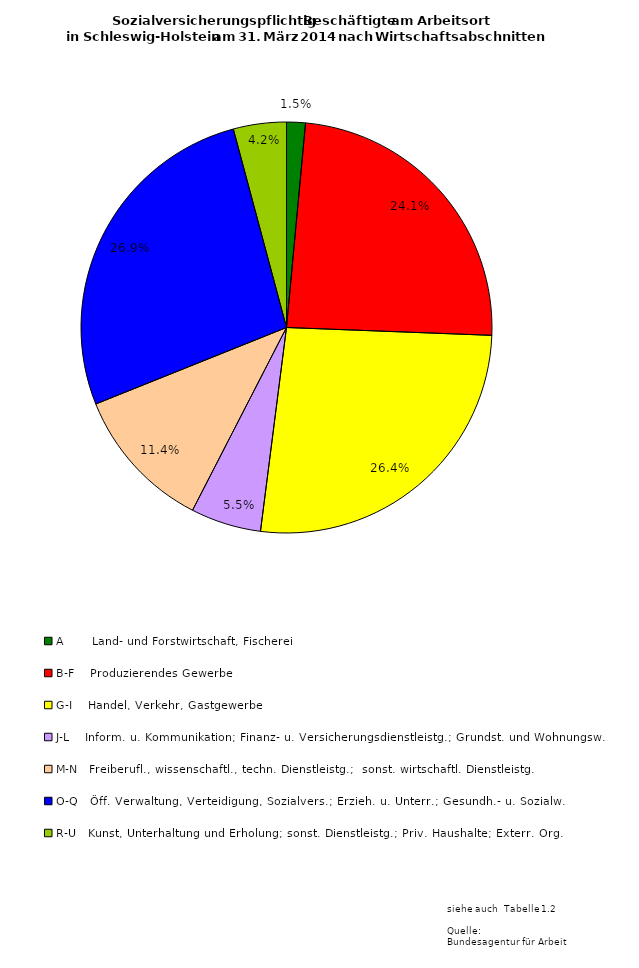
| Category | Series 0 | Series 1 | Series 2 |
|---|---|---|---|
| A       Land- und Forstwirtschaft, Fischerei | 13100 | 3535 | 9565 |
| B-F    Produzierendes Gewerbe | 213756 | 48910 | 164846 |
| G-I    Handel, Verkehr, Gastgewerbe | 234000 | 105645 | 128355 |
| J-L    Inform. u. Kommunikation; Finanz- u. Versicherungsdienstleistg.; Grundst. und Wohnungsw. | 49058 | 23744 | 25314 |
| M-N   Freiberufl., wissenschaftl., techn. Dienstleistg.;  sonst. wirtschaftl. Dienstleistg.  | 100705 | 47766 | 52939 |
| O-Q   Öff. Verwaltung, Verteidigung, Sozialvers.; Erzieh. u. Unterr.; Gesundh.- u. Sozialw. | 238344 | 168786 | 69558 |
| R-U   Kunst, Unterhaltung und Erholung; sonst. Dienstleistg.; Priv. Haushalte; Exterr. Org. | 36928 | 25468 | 11460 |